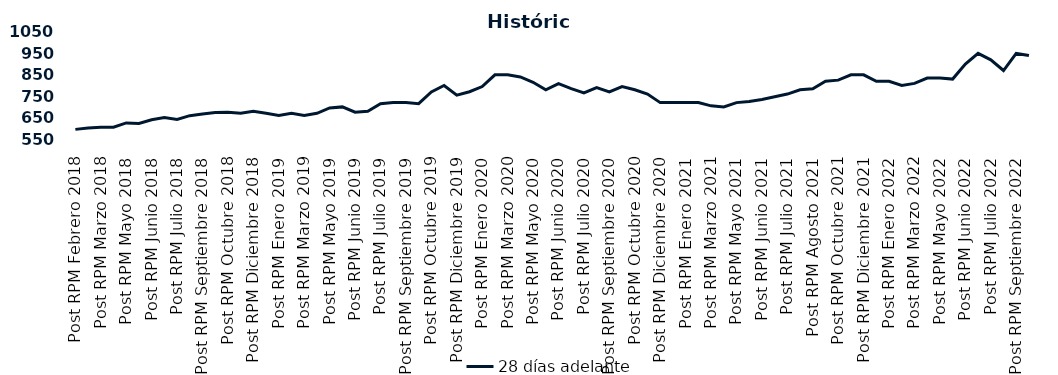
| Category | 28 días adelante |
|---|---|
| Post RPM Febrero 2018 | 595 |
| Pre RPM Marzo 2018 | 601 |
| Post RPM Marzo 2018 | 605 |
| Pre RPM Mayo 2018 | 605 |
| Post RPM Mayo 2018 | 625 |
| Pre RPM Junio 2018 | 623 |
| Post RPM Junio 2018 | 640 |
| Pre RPM Julio 2018 | 650 |
| Post RPM Julio 2018 | 641 |
| Pre RPM Septiembre 2018 | 659 |
| Post RPM Septiembre 2018 | 666.75 |
| Pre RPM Octubre 2018 | 674 |
| Post RPM Octubre 2018 | 675 |
| Pre RPM Diciembre 2018 | 670 |
| Post RPM Diciembre 2018 | 680 |
| Pre RPM Enero 2019 | 670 |
| Post RPM Enero 2019 | 660 |
| Pre RPM Marzo 2019 | 670 |
| Post RPM Marzo 2019 | 660 |
| Pre RPM Mayo 2019 | 670 |
| Post RPM Mayo 2019 | 695 |
| Pre RPM Junio 2019 | 700 |
| Post RPM Junio 2019 | 675 |
| Pre RPM Julio 2019 | 680 |
| Post RPM Julio 2019 | 715 |
| Pre RPM Septiembre 2019 | 720 |
| Post RPM Septiembre 2019 | 720 |
| Pre RPM Octubre 2019 | 715 |
| Post RPM Octubre 2019 | 770 |
| Pre RPM Diciembre 2019 | 800 |
| Post RPM Diciembre 2019 | 755 |
| Pre RPM Enero 2020 | 771 |
| Post RPM Enero 2020 | 795 |
| Pre RPM Marzo 2020 | 850 |
| Post RPM Marzo 2020 | 850 |
| Pre RPM Mayo 2020 | 840 |
| Post RPM Mayo 2020 | 815 |
| Pre RPM Junio 2020 | 780 |
| Post RPM Junio 2020 | 809 |
| Pre RPM Julio 2020 | 785.72 |
| Post RPM Julio 2020 | 765 |
| Pre RPM Septiembre 2020 | 790 |
| Post RPM Septiembre 2020 | 770 |
| Pre RPM Octubre 2020 | 795 |
| Post RPM Octubre 2020 | 780 |
| Pre RPM Diciembre 2020 | 760 |
| Post RPM Diciembre 2020 | 720 |
| Pre RPM Enero 2021 | 720 |
| Post RPM Enero 2021 | 720 |
| Pre RPM Marzo 2021 | 720 |
| Post RPM Marzo 2021 | 705 |
| Pre RPM Mayo 2021 | 700 |
| Post RPM Mayo 2021 | 720 |
| Pre RPM Junio 2021 | 725 |
| Post RPM Junio 2021 | 735 |
| Pre RPM Julio 2021 | 747.5 |
| Post RPM Julio 2021 | 760 |
| Pre RPM Agosto 2021 | 780 |
| Post RPM Agosto 2021 | 785 |
| Pre RPM Octubre 2021 | 820 |
| Post RPM Octubre 2021 | 825 |
| Pre RPM Diciembre 2021 | 850 |
| Post RPM Diciembre 2021 | 850 |
| Pre RPM Enero 2022 | 820 |
| Post RPM Enero 2022 | 820 |
| Pre RPM Marzo 2022 | 800 |
| Post RPM Marzo 2022 | 810 |
| Pre RPM Mayo 2022 | 835 |
| Post RPM Mayo 2022 | 835 |
| Pre RPM Junio 2022 | 830 |
| Post RPM Junio 2022 | 900 |
| Pre RPM Julio 2022 | 950 |
| Post RPM Julio 2022 | 920 |
| Pre RPM Septiembre 2022 | 870 |
| Post RPM Septiembre 2022 | 950 |
| Pre RPM Octubre 2022 | 940 |